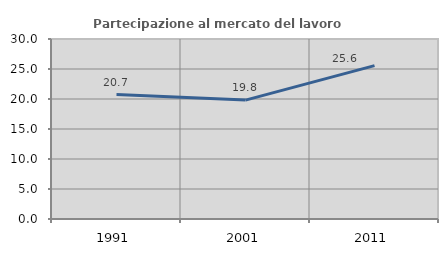
| Category | Partecipazione al mercato del lavoro  femminile |
|---|---|
| 1991.0 | 20.746 |
| 2001.0 | 19.818 |
| 2011.0 | 25.558 |